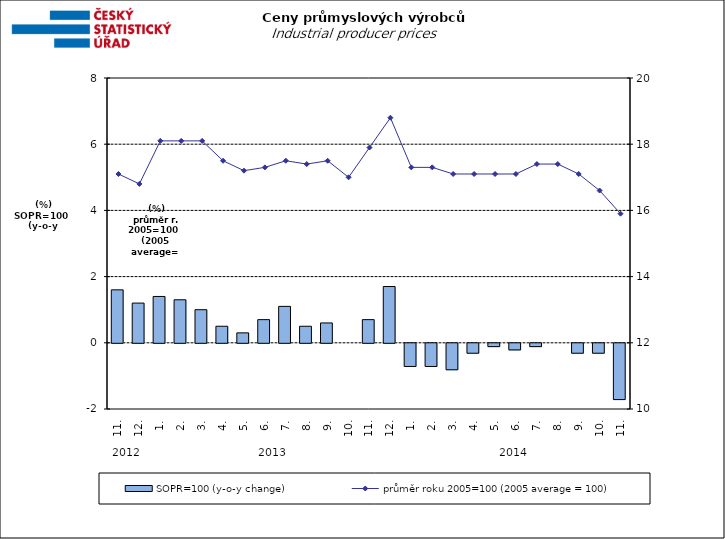
| Category | SOPR=100 (y-o-y change)   |
|---|---|
| 0 | 1.6 |
| 1 | 1.2 |
| 2 | 1.4 |
| 3 | 1.3 |
| 4 | 1 |
| 5 | 0.5 |
| 6 | 0.3 |
| 7 | 0.7 |
| 8 | 1.1 |
| 9 | 0.5 |
| 10 | 0.6 |
| 11 | 0 |
| 12 | 0.7 |
| 13 | 1.7 |
| 14 | -0.7 |
| 15 | -0.7 |
| 16 | -0.8 |
| 17 | -0.3 |
| 18 | -0.1 |
| 19 | -0.2 |
| 20 | -0.1 |
| 21 | 0 |
| 22 | -0.3 |
| 23 | -0.3 |
| 24 | -1.7 |